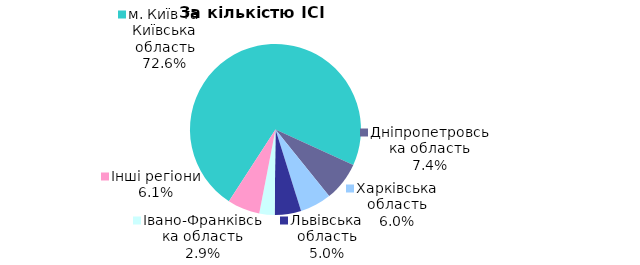
| Category | Series 0 |
|---|---|
| м. Київ та Київська область | 0.726 |
| Дніпропетровська область | 0.074 |
| Харківська область | 0.06 |
| Львівська область | 0.05 |
| Iвано-Франкiвська область | 0.029 |
| Інші регіони | 0.061 |